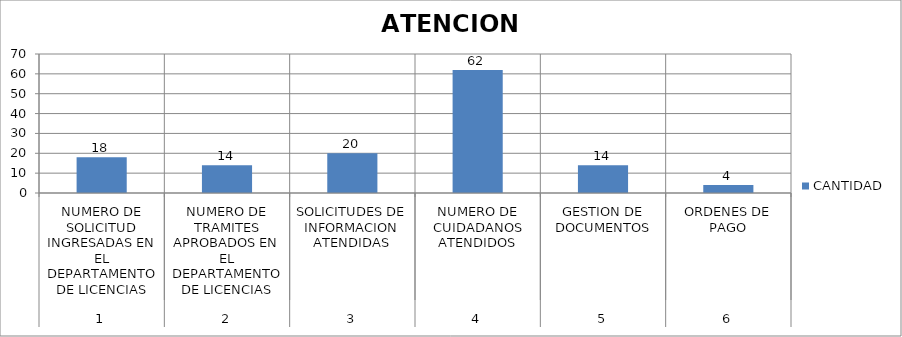
| Category | CANTIDAD |
|---|---|
| 0 | 18 |
| 1 | 14 |
| 2 | 20 |
| 3 | 62 |
| 4 | 14 |
| 5 | 4 |